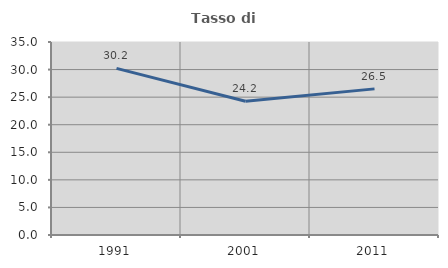
| Category | Tasso di occupazione   |
|---|---|
| 1991.0 | 30.215 |
| 2001.0 | 24.242 |
| 2011.0 | 26.5 |